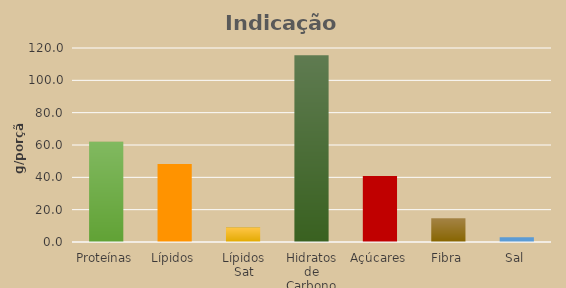
| Category | Series 0 |
|---|---|
| Proteínas | 62.008 |
| Lípidos | 48.228 |
| Lípidos Sat | 8.932 |
| Hidratos de Carbono | 115.503 |
| Açúcares | 40.863 |
| Fibra | 14.736 |
| Sal | 2.862 |